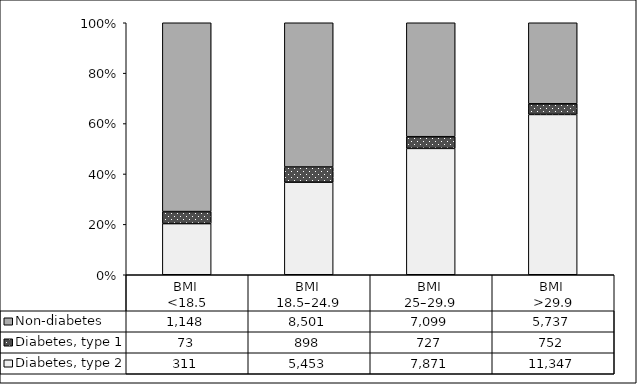
| Category | Diabetes, type 2 | Diabetes, type 1 | Non-diabetes |
|---|---|---|---|
| BMI 
<18.5 | 311 | 73 | 1148 |
| BMI 
18.5–24.9 | 5453 | 898 | 8501 |
| BMI 
25–29.9 | 7871 | 727 | 7099 |
| BMI 
>29.9 | 11347 | 752 | 5737 |